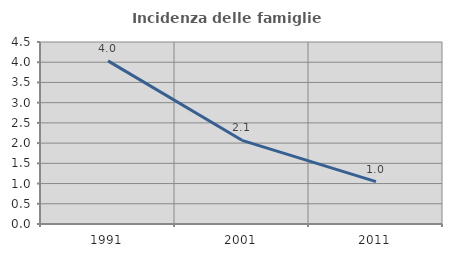
| Category | Incidenza delle famiglie numerose |
|---|---|
| 1991.0 | 4.034 |
| 2001.0 | 2.069 |
| 2011.0 | 1.048 |